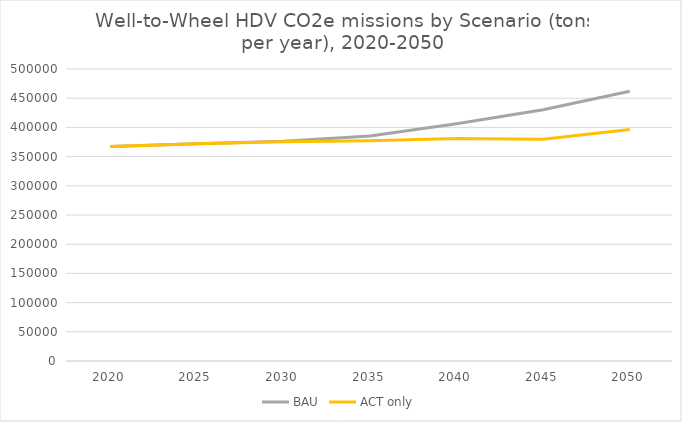
| Category | BAU | ACT only |
|---|---|---|
| 2020.0 | 367406.576 | 367406.576 |
| 2025.0 | 371840.379 | 371840.379 |
| 2030.0 | 376109.444 | 375346.472 |
| 2035.0 | 385352.014 | 377295.459 |
| 2040.0 | 406334.685 | 381085.668 |
| 2045.0 | 430347.663 | 379573.13 |
| 2050.0 | 462036.951 | 396529.865 |